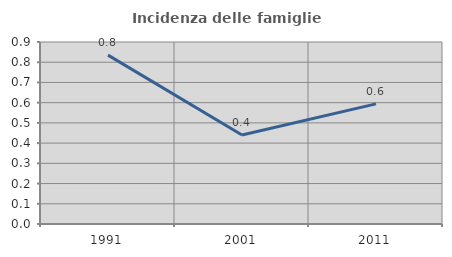
| Category | Incidenza delle famiglie numerose |
|---|---|
| 1991.0 | 0.835 |
| 2001.0 | 0.44 |
| 2011.0 | 0.594 |